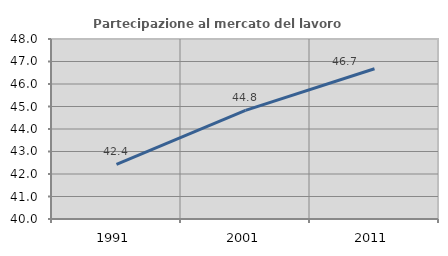
| Category | Partecipazione al mercato del lavoro  femminile |
|---|---|
| 1991.0 | 42.424 |
| 2001.0 | 44.828 |
| 2011.0 | 46.677 |